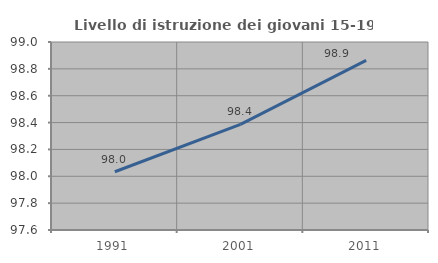
| Category | Livello di istruzione dei giovani 15-19 anni |
|---|---|
| 1991.0 | 98.034 |
| 2001.0 | 98.387 |
| 2011.0 | 98.864 |